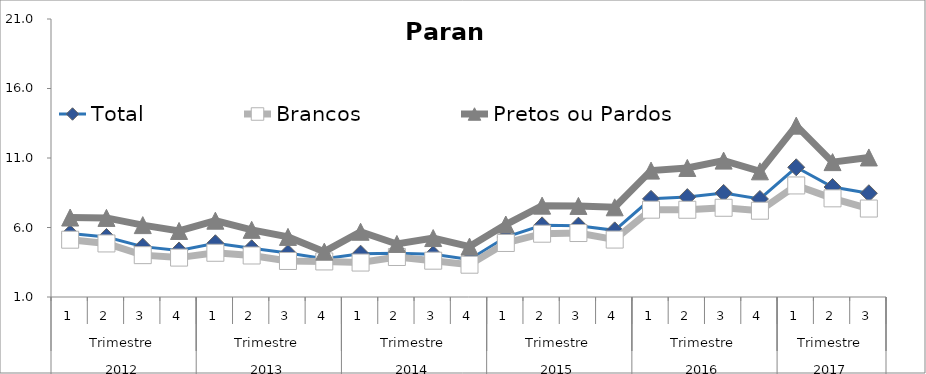
| Category | Total | Brancos | Pretos ou Pardos |
|---|---|---|---|
| 0 | 5.562 | 5.122 | 6.717 |
| 1 | 5.319 | 4.852 | 6.691 |
| 2 | 4.624 | 4.011 | 6.172 |
| 3 | 4.347 | 3.834 | 5.75 |
| 4 | 4.868 | 4.182 | 6.491 |
| 5 | 4.505 | 3.986 | 5.832 |
| 6 | 4.158 | 3.592 | 5.323 |
| 7 | 3.746 | 3.558 | 4.26 |
| 8 | 4.118 | 3.478 | 5.694 |
| 9 | 4.147 | 3.878 | 4.816 |
| 10 | 4.071 | 3.613 | 5.24 |
| 11 | 3.7 | 3.323 | 4.626 |
| 12 | 5.311 | 4.886 | 6.214 |
| 13 | 6.154 | 5.553 | 7.572 |
| 14 | 6.133 | 5.602 | 7.553 |
| 15 | 5.794 | 5.132 | 7.452 |
| 16 | 8.063 | 7.282 | 10.092 |
| 17 | 8.187 | 7.277 | 10.284 |
| 18 | 8.486 | 7.419 | 10.812 |
| 19 | 8.052 | 7.209 | 10.041 |
| 20 | 10.333 | 9.025 | 13.328 |
| 21 | 8.912 | 8.099 | 10.702 |
| 22 | 8.463 | 7.364 | 11.039 |